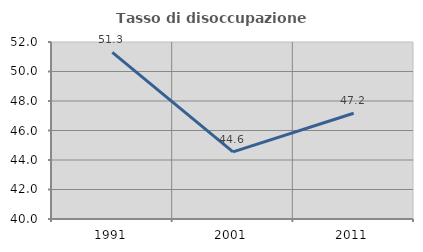
| Category | Tasso di disoccupazione giovanile  |
|---|---|
| 1991.0 | 51.297 |
| 2001.0 | 44.554 |
| 2011.0 | 47.17 |